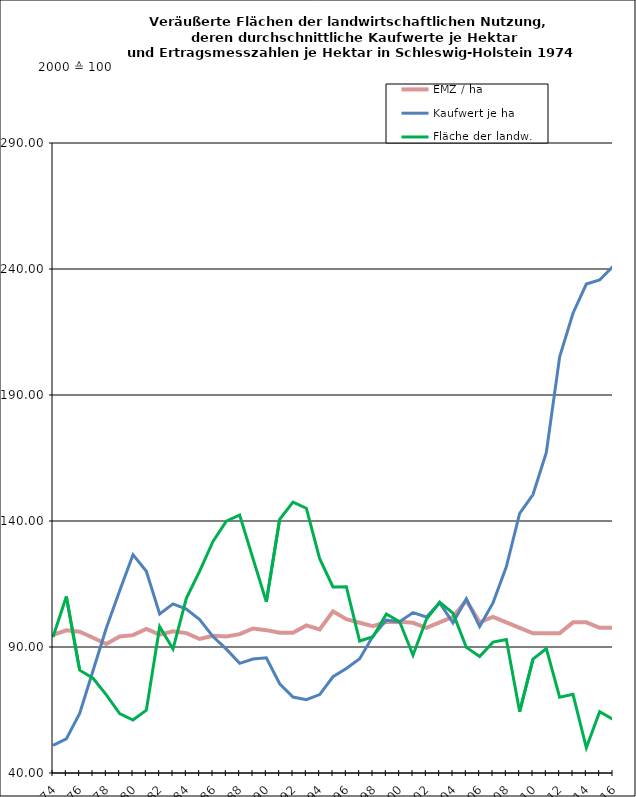
| Category | EMZ / ha | Kaufwert je ha | Fläche der landw. Nutzung |
|---|---|---|---|
| 1974.0 | 94.795 | 51 | 93.981 |
| 1975.0 | 96.597 | 53.545 | 110.037 |
| 1976.0 | 96.097 | 63.639 | 80.798 |
| 1977.0 | 93.651 | 80.567 | 77.6 |
| 1978.0 | 91.177 | 97.503 | 70.981 |
| 1979.0 | 94.169 | 112.291 | 63.587 |
| 1980.0 | 94.702 | 126.649 | 61.017 |
| 1981.0 | 97.202 | 120.065 | 64.89 |
| 1982.0 | 94.914 | 103.096 | 98.077 |
| 1983.0 | 96.246 | 107.125 | 89.198 |
| 1984.0 | 95.527 | 105.048 | 109.324 |
| 1985.0 | 93.182 | 100.843 | 120.09 |
| 1986.0 | 94.48 | 94.135 | 131.88 |
| 1987.0 | 94.141 | 89.159 | 139.897 |
| 1988.0 | 95.081 | 83.528 | 142.385 |
| 1989.0 | 97.343 | 85.246 | 125.065 |
| 1990.0 | 96.683 | 85.684 | 107.96 |
| 1991.0 | 95.675 | 75.423 | 140.67 |
| 1992.0 | 95.651 | 70.143 | 147.485 |
| 1993.0 | 98.57 | 69.101 | 145.071 |
| 1994.0 | 96.941 | 71.113 | 125.075 |
| 1995.0 | 104.16 | 78.2 | 113.839 |
| 1996.0 | 101.007 | 81.509 | 113.945 |
| 1997.0 | 99.604 | 85.367 | 92.368 |
| 1998.0 | 98.258 | 94.343 | 94.074 |
| 1999.0 | 99.97 | 100.651 | 103.111 |
| 2000.0 | 100 | 100 | 100 |
| 2001.0 | 99.588 | 103.657 | 86.753 |
| 2002.0 | 97.614 | 101.94 | 100.958 |
| 2003.0 | 99.783 | 107.499 | 107.763 |
| 2004.0 | 101.952 | 99.575 | 103.431 |
| 2005.0 | 108.46 | 109.153 | 89.843 |
| 2006.0 | 99.783 | 98.107 | 86.202 |
| 2007.0 | 101.952 | 107.508 | 91.94 |
| 2008.0 | 99.783 | 121.845 | 93.002 |
| 2009.0 | 97.614 | 143.056 | 64.336 |
| 2010.0 | 95.445 | 150.509 | 85.196 |
| 2011.0 | 95.445 | 167.176 | 89.386 |
| 2012.0 | 95.445 | 205.117 | 70.111 |
| 2013.0 | 99.783 | 222.46 | 71.215 |
| 2014.0 | 99.783 | 234.004 | 50.013 |
| 2015.0 | 97.614 | 235.632 | 64.355 |
| 2016.0 | 97.614 | 241.03 | 61.26 |